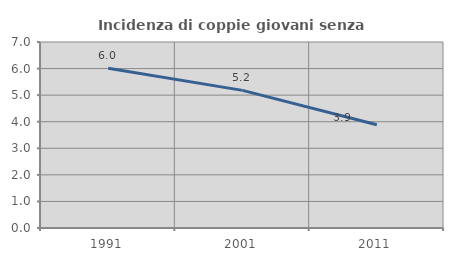
| Category | Incidenza di coppie giovani senza figli |
|---|---|
| 1991.0 | 6.013 |
| 2001.0 | 5.179 |
| 2011.0 | 3.887 |